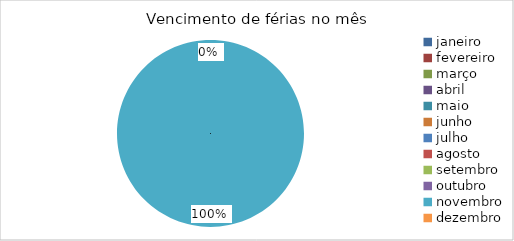
| Category | Vencimento de férias no mês |
|---|---|
| janeiro | 0 |
| fevereiro | 0 |
| março | 0 |
| abril | 0 |
| maio | 0 |
| junho | 0 |
| julho | 0 |
| agosto | 0 |
| setembro | 0 |
| outubro | 0 |
| novembro | 1 |
| dezembro | 0 |